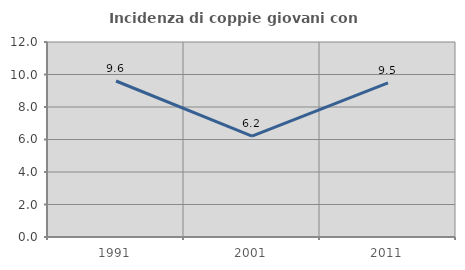
| Category | Incidenza di coppie giovani con figli |
|---|---|
| 1991.0 | 9.6 |
| 2001.0 | 6.202 |
| 2011.0 | 9.489 |